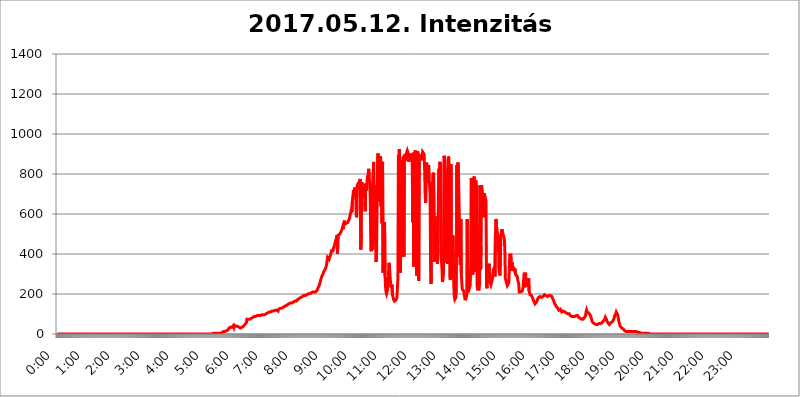
| Category | 2017.05.12. Intenzitás [W/m^2] |
|---|---|
| 0.0 | 0 |
| 0.0006944444444444445 | 0 |
| 0.001388888888888889 | 0 |
| 0.0020833333333333333 | 0 |
| 0.002777777777777778 | 0 |
| 0.003472222222222222 | 0 |
| 0.004166666666666667 | 0 |
| 0.004861111111111111 | 0 |
| 0.005555555555555556 | 0 |
| 0.0062499999999999995 | 0 |
| 0.006944444444444444 | 0 |
| 0.007638888888888889 | 0 |
| 0.008333333333333333 | 0 |
| 0.009027777777777779 | 0 |
| 0.009722222222222222 | 0 |
| 0.010416666666666666 | 0 |
| 0.011111111111111112 | 0 |
| 0.011805555555555555 | 0 |
| 0.012499999999999999 | 0 |
| 0.013194444444444444 | 0 |
| 0.013888888888888888 | 0 |
| 0.014583333333333332 | 0 |
| 0.015277777777777777 | 0 |
| 0.015972222222222224 | 0 |
| 0.016666666666666666 | 0 |
| 0.017361111111111112 | 0 |
| 0.018055555555555557 | 0 |
| 0.01875 | 0 |
| 0.019444444444444445 | 0 |
| 0.02013888888888889 | 0 |
| 0.020833333333333332 | 0 |
| 0.02152777777777778 | 0 |
| 0.022222222222222223 | 0 |
| 0.02291666666666667 | 0 |
| 0.02361111111111111 | 0 |
| 0.024305555555555556 | 0 |
| 0.024999999999999998 | 0 |
| 0.025694444444444447 | 0 |
| 0.02638888888888889 | 0 |
| 0.027083333333333334 | 0 |
| 0.027777777777777776 | 0 |
| 0.02847222222222222 | 0 |
| 0.029166666666666664 | 0 |
| 0.029861111111111113 | 0 |
| 0.030555555555555555 | 0 |
| 0.03125 | 0 |
| 0.03194444444444445 | 0 |
| 0.03263888888888889 | 0 |
| 0.03333333333333333 | 0 |
| 0.034027777777777775 | 0 |
| 0.034722222222222224 | 0 |
| 0.035416666666666666 | 0 |
| 0.036111111111111115 | 0 |
| 0.03680555555555556 | 0 |
| 0.0375 | 0 |
| 0.03819444444444444 | 0 |
| 0.03888888888888889 | 0 |
| 0.03958333333333333 | 0 |
| 0.04027777777777778 | 0 |
| 0.04097222222222222 | 0 |
| 0.041666666666666664 | 0 |
| 0.042361111111111106 | 0 |
| 0.04305555555555556 | 0 |
| 0.043750000000000004 | 0 |
| 0.044444444444444446 | 0 |
| 0.04513888888888889 | 0 |
| 0.04583333333333334 | 0 |
| 0.04652777777777778 | 0 |
| 0.04722222222222222 | 0 |
| 0.04791666666666666 | 0 |
| 0.04861111111111111 | 0 |
| 0.049305555555555554 | 0 |
| 0.049999999999999996 | 0 |
| 0.05069444444444445 | 0 |
| 0.051388888888888894 | 0 |
| 0.052083333333333336 | 0 |
| 0.05277777777777778 | 0 |
| 0.05347222222222222 | 0 |
| 0.05416666666666667 | 0 |
| 0.05486111111111111 | 0 |
| 0.05555555555555555 | 0 |
| 0.05625 | 0 |
| 0.05694444444444444 | 0 |
| 0.057638888888888885 | 0 |
| 0.05833333333333333 | 0 |
| 0.05902777777777778 | 0 |
| 0.059722222222222225 | 0 |
| 0.06041666666666667 | 0 |
| 0.061111111111111116 | 0 |
| 0.06180555555555556 | 0 |
| 0.0625 | 0 |
| 0.06319444444444444 | 0 |
| 0.06388888888888888 | 0 |
| 0.06458333333333334 | 0 |
| 0.06527777777777778 | 0 |
| 0.06597222222222222 | 0 |
| 0.06666666666666667 | 0 |
| 0.06736111111111111 | 0 |
| 0.06805555555555555 | 0 |
| 0.06874999999999999 | 0 |
| 0.06944444444444443 | 0 |
| 0.07013888888888889 | 0 |
| 0.07083333333333333 | 0 |
| 0.07152777777777779 | 0 |
| 0.07222222222222223 | 0 |
| 0.07291666666666667 | 0 |
| 0.07361111111111111 | 0 |
| 0.07430555555555556 | 0 |
| 0.075 | 0 |
| 0.07569444444444444 | 0 |
| 0.0763888888888889 | 0 |
| 0.07708333333333334 | 0 |
| 0.07777777777777778 | 0 |
| 0.07847222222222222 | 0 |
| 0.07916666666666666 | 0 |
| 0.0798611111111111 | 0 |
| 0.08055555555555556 | 0 |
| 0.08125 | 0 |
| 0.08194444444444444 | 0 |
| 0.08263888888888889 | 0 |
| 0.08333333333333333 | 0 |
| 0.08402777777777777 | 0 |
| 0.08472222222222221 | 0 |
| 0.08541666666666665 | 0 |
| 0.08611111111111112 | 0 |
| 0.08680555555555557 | 0 |
| 0.08750000000000001 | 0 |
| 0.08819444444444445 | 0 |
| 0.08888888888888889 | 0 |
| 0.08958333333333333 | 0 |
| 0.09027777777777778 | 0 |
| 0.09097222222222222 | 0 |
| 0.09166666666666667 | 0 |
| 0.09236111111111112 | 0 |
| 0.09305555555555556 | 0 |
| 0.09375 | 0 |
| 0.09444444444444444 | 0 |
| 0.09513888888888888 | 0 |
| 0.09583333333333333 | 0 |
| 0.09652777777777777 | 0 |
| 0.09722222222222222 | 0 |
| 0.09791666666666667 | 0 |
| 0.09861111111111111 | 0 |
| 0.09930555555555555 | 0 |
| 0.09999999999999999 | 0 |
| 0.10069444444444443 | 0 |
| 0.1013888888888889 | 0 |
| 0.10208333333333335 | 0 |
| 0.10277777777777779 | 0 |
| 0.10347222222222223 | 0 |
| 0.10416666666666667 | 0 |
| 0.10486111111111111 | 0 |
| 0.10555555555555556 | 0 |
| 0.10625 | 0 |
| 0.10694444444444444 | 0 |
| 0.1076388888888889 | 0 |
| 0.10833333333333334 | 0 |
| 0.10902777777777778 | 0 |
| 0.10972222222222222 | 0 |
| 0.1111111111111111 | 0 |
| 0.11180555555555556 | 0 |
| 0.11180555555555556 | 0 |
| 0.1125 | 0 |
| 0.11319444444444444 | 0 |
| 0.11388888888888889 | 0 |
| 0.11458333333333333 | 0 |
| 0.11527777777777777 | 0 |
| 0.11597222222222221 | 0 |
| 0.11666666666666665 | 0 |
| 0.1173611111111111 | 0 |
| 0.11805555555555557 | 0 |
| 0.11944444444444445 | 0 |
| 0.12013888888888889 | 0 |
| 0.12083333333333333 | 0 |
| 0.12152777777777778 | 0 |
| 0.12222222222222223 | 0 |
| 0.12291666666666667 | 0 |
| 0.12291666666666667 | 0 |
| 0.12361111111111112 | 0 |
| 0.12430555555555556 | 0 |
| 0.125 | 0 |
| 0.12569444444444444 | 0 |
| 0.12638888888888888 | 0 |
| 0.12708333333333333 | 0 |
| 0.16875 | 0 |
| 0.12847222222222224 | 0 |
| 0.12916666666666668 | 0 |
| 0.12986111111111112 | 0 |
| 0.13055555555555556 | 0 |
| 0.13125 | 0 |
| 0.13194444444444445 | 0 |
| 0.1326388888888889 | 0 |
| 0.13333333333333333 | 0 |
| 0.13402777777777777 | 0 |
| 0.13402777777777777 | 0 |
| 0.13472222222222222 | 0 |
| 0.13541666666666666 | 0 |
| 0.1361111111111111 | 0 |
| 0.13749999999999998 | 0 |
| 0.13819444444444443 | 0 |
| 0.1388888888888889 | 0 |
| 0.13958333333333334 | 0 |
| 0.14027777777777778 | 0 |
| 0.14097222222222222 | 0 |
| 0.14166666666666666 | 0 |
| 0.1423611111111111 | 0 |
| 0.14305555555555557 | 0 |
| 0.14375000000000002 | 0 |
| 0.14444444444444446 | 0 |
| 0.1451388888888889 | 0 |
| 0.1451388888888889 | 0 |
| 0.14652777777777778 | 0 |
| 0.14722222222222223 | 0 |
| 0.14791666666666667 | 0 |
| 0.1486111111111111 | 0 |
| 0.14930555555555555 | 0 |
| 0.15 | 0 |
| 0.15069444444444444 | 0 |
| 0.15138888888888888 | 0 |
| 0.15208333333333332 | 0 |
| 0.15277777777777776 | 0 |
| 0.15347222222222223 | 0 |
| 0.15416666666666667 | 0 |
| 0.15486111111111112 | 0 |
| 0.15555555555555556 | 0 |
| 0.15625 | 0 |
| 0.15694444444444444 | 0 |
| 0.15763888888888888 | 0 |
| 0.15833333333333333 | 0 |
| 0.15902777777777777 | 0 |
| 0.15972222222222224 | 0 |
| 0.16041666666666668 | 0 |
| 0.16111111111111112 | 0 |
| 0.16180555555555556 | 0 |
| 0.1625 | 0 |
| 0.16319444444444445 | 0 |
| 0.1638888888888889 | 0 |
| 0.16458333333333333 | 0 |
| 0.16527777777777777 | 0 |
| 0.16597222222222222 | 0 |
| 0.16666666666666666 | 0 |
| 0.1673611111111111 | 0 |
| 0.16805555555555554 | 0 |
| 0.16874999999999998 | 0 |
| 0.16944444444444443 | 0 |
| 0.17013888888888887 | 0 |
| 0.1708333333333333 | 0 |
| 0.17152777777777775 | 0 |
| 0.17222222222222225 | 0 |
| 0.1729166666666667 | 0 |
| 0.17361111111111113 | 0 |
| 0.17430555555555557 | 0 |
| 0.17500000000000002 | 0 |
| 0.17569444444444446 | 0 |
| 0.1763888888888889 | 0 |
| 0.17708333333333334 | 0 |
| 0.17777777777777778 | 0 |
| 0.17847222222222223 | 0 |
| 0.17916666666666667 | 0 |
| 0.1798611111111111 | 0 |
| 0.18055555555555555 | 0 |
| 0.18125 | 0 |
| 0.18194444444444444 | 0 |
| 0.1826388888888889 | 0 |
| 0.18333333333333335 | 0 |
| 0.1840277777777778 | 0 |
| 0.18472222222222223 | 0 |
| 0.18541666666666667 | 0 |
| 0.18611111111111112 | 0 |
| 0.18680555555555556 | 0 |
| 0.1875 | 0 |
| 0.18819444444444444 | 0 |
| 0.18888888888888888 | 0 |
| 0.18958333333333333 | 0 |
| 0.19027777777777777 | 0 |
| 0.1909722222222222 | 0 |
| 0.19166666666666665 | 0 |
| 0.19236111111111112 | 0 |
| 0.19305555555555554 | 0 |
| 0.19375 | 0 |
| 0.19444444444444445 | 0 |
| 0.1951388888888889 | 0 |
| 0.19583333333333333 | 0 |
| 0.19652777777777777 | 0 |
| 0.19722222222222222 | 0 |
| 0.19791666666666666 | 0 |
| 0.1986111111111111 | 0 |
| 0.19930555555555554 | 0 |
| 0.19999999999999998 | 0 |
| 0.20069444444444443 | 0 |
| 0.20138888888888887 | 0 |
| 0.2020833333333333 | 0 |
| 0.2027777777777778 | 0 |
| 0.2034722222222222 | 0 |
| 0.2041666666666667 | 0 |
| 0.20486111111111113 | 0 |
| 0.20555555555555557 | 0 |
| 0.20625000000000002 | 0 |
| 0.20694444444444446 | 0 |
| 0.2076388888888889 | 0 |
| 0.20833333333333334 | 0 |
| 0.20902777777777778 | 0 |
| 0.20972222222222223 | 0 |
| 0.21041666666666667 | 0 |
| 0.2111111111111111 | 0 |
| 0.21180555555555555 | 0 |
| 0.2125 | 0 |
| 0.21319444444444444 | 0 |
| 0.2138888888888889 | 0 |
| 0.21458333333333335 | 0 |
| 0.2152777777777778 | 0 |
| 0.21597222222222223 | 0 |
| 0.21666666666666667 | 0 |
| 0.21736111111111112 | 0 |
| 0.21805555555555556 | 0 |
| 0.21875 | 3.525 |
| 0.21944444444444444 | 3.525 |
| 0.22013888888888888 | 3.525 |
| 0.22083333333333333 | 3.525 |
| 0.22152777777777777 | 3.525 |
| 0.2222222222222222 | 3.525 |
| 0.22291666666666665 | 3.525 |
| 0.2236111111111111 | 3.525 |
| 0.22430555555555556 | 3.525 |
| 0.225 | 3.525 |
| 0.22569444444444445 | 3.525 |
| 0.2263888888888889 | 3.525 |
| 0.22708333333333333 | 3.525 |
| 0.22777777777777777 | 3.525 |
| 0.22847222222222222 | 3.525 |
| 0.22916666666666666 | 3.525 |
| 0.2298611111111111 | 7.887 |
| 0.23055555555555554 | 7.887 |
| 0.23124999999999998 | 7.887 |
| 0.23194444444444443 | 7.887 |
| 0.23263888888888887 | 7.887 |
| 0.2333333333333333 | 12.257 |
| 0.2340277777777778 | 12.257 |
| 0.2347222222222222 | 12.257 |
| 0.2354166666666667 | 12.257 |
| 0.23611111111111113 | 12.257 |
| 0.23680555555555557 | 16.636 |
| 0.23750000000000002 | 16.636 |
| 0.23819444444444446 | 21.024 |
| 0.2388888888888889 | 21.024 |
| 0.23958333333333334 | 21.024 |
| 0.24027777777777778 | 25.419 |
| 0.24097222222222223 | 29.823 |
| 0.24166666666666667 | 29.823 |
| 0.2423611111111111 | 34.234 |
| 0.24305555555555555 | 34.234 |
| 0.24375 | 34.234 |
| 0.24444444444444446 | 34.234 |
| 0.24513888888888888 | 34.234 |
| 0.24583333333333335 | 34.234 |
| 0.2465277777777778 | 34.234 |
| 0.24722222222222223 | 43.079 |
| 0.24791666666666667 | 34.234 |
| 0.24861111111111112 | 43.079 |
| 0.24930555555555556 | 43.079 |
| 0.25 | 43.079 |
| 0.25069444444444444 | 38.653 |
| 0.2513888888888889 | 38.653 |
| 0.2520833333333333 | 38.653 |
| 0.25277777777777777 | 38.653 |
| 0.2534722222222222 | 38.653 |
| 0.25416666666666665 | 38.653 |
| 0.2548611111111111 | 34.234 |
| 0.2555555555555556 | 29.823 |
| 0.25625000000000003 | 29.823 |
| 0.2569444444444445 | 29.823 |
| 0.2576388888888889 | 29.823 |
| 0.25833333333333336 | 29.823 |
| 0.2590277777777778 | 34.234 |
| 0.25972222222222224 | 34.234 |
| 0.2604166666666667 | 34.234 |
| 0.2611111111111111 | 38.653 |
| 0.26180555555555557 | 43.079 |
| 0.2625 | 43.079 |
| 0.26319444444444445 | 47.511 |
| 0.2638888888888889 | 47.511 |
| 0.26458333333333334 | 47.511 |
| 0.2652777777777778 | 56.398 |
| 0.2659722222222222 | 74.246 |
| 0.26666666666666666 | 74.246 |
| 0.2673611111111111 | 69.775 |
| 0.26805555555555555 | 74.246 |
| 0.26875 | 74.246 |
| 0.26944444444444443 | 74.246 |
| 0.2701388888888889 | 74.246 |
| 0.2708333333333333 | 78.722 |
| 0.27152777777777776 | 78.722 |
| 0.2722222222222222 | 78.722 |
| 0.27291666666666664 | 83.205 |
| 0.2736111111111111 | 83.205 |
| 0.2743055555555555 | 83.205 |
| 0.27499999999999997 | 83.205 |
| 0.27569444444444446 | 83.205 |
| 0.27638888888888885 | 87.692 |
| 0.27708333333333335 | 87.692 |
| 0.2777777777777778 | 87.692 |
| 0.27847222222222223 | 87.692 |
| 0.2791666666666667 | 87.692 |
| 0.2798611111111111 | 87.692 |
| 0.28055555555555556 | 92.184 |
| 0.28125 | 92.184 |
| 0.28194444444444444 | 92.184 |
| 0.2826388888888889 | 92.184 |
| 0.2833333333333333 | 92.184 |
| 0.28402777777777777 | 92.184 |
| 0.2847222222222222 | 92.184 |
| 0.28541666666666665 | 96.682 |
| 0.28611111111111115 | 96.682 |
| 0.28680555555555554 | 96.682 |
| 0.28750000000000003 | 96.682 |
| 0.2881944444444445 | 96.682 |
| 0.2888888888888889 | 96.682 |
| 0.28958333333333336 | 96.682 |
| 0.2902777777777778 | 96.682 |
| 0.29097222222222224 | 96.682 |
| 0.2916666666666667 | 101.184 |
| 0.2923611111111111 | 101.184 |
| 0.29305555555555557 | 101.184 |
| 0.29375 | 101.184 |
| 0.29444444444444445 | 105.69 |
| 0.2951388888888889 | 105.69 |
| 0.29583333333333334 | 105.69 |
| 0.2965277777777778 | 105.69 |
| 0.2972222222222222 | 110.201 |
| 0.29791666666666666 | 110.201 |
| 0.2986111111111111 | 110.201 |
| 0.29930555555555555 | 110.201 |
| 0.3 | 110.201 |
| 0.30069444444444443 | 114.716 |
| 0.3013888888888889 | 114.716 |
| 0.3020833333333333 | 114.716 |
| 0.30277777777777776 | 114.716 |
| 0.3034722222222222 | 114.716 |
| 0.30416666666666664 | 114.716 |
| 0.3048611111111111 | 119.235 |
| 0.3055555555555555 | 119.235 |
| 0.30624999999999997 | 119.235 |
| 0.3069444444444444 | 119.235 |
| 0.3076388888888889 | 119.235 |
| 0.30833333333333335 | 119.235 |
| 0.3090277777777778 | 119.235 |
| 0.30972222222222223 | 114.716 |
| 0.3104166666666667 | 123.758 |
| 0.3111111111111111 | 123.758 |
| 0.31180555555555556 | 123.758 |
| 0.3125 | 128.284 |
| 0.31319444444444444 | 128.284 |
| 0.3138888888888889 | 128.284 |
| 0.3145833333333333 | 128.284 |
| 0.31527777777777777 | 132.814 |
| 0.3159722222222222 | 132.814 |
| 0.31666666666666665 | 132.814 |
| 0.31736111111111115 | 137.347 |
| 0.31805555555555554 | 137.347 |
| 0.31875000000000003 | 137.347 |
| 0.3194444444444445 | 137.347 |
| 0.3201388888888889 | 141.884 |
| 0.32083333333333336 | 141.884 |
| 0.3215277777777778 | 146.423 |
| 0.32222222222222224 | 146.423 |
| 0.3229166666666667 | 146.423 |
| 0.3236111111111111 | 146.423 |
| 0.32430555555555557 | 150.964 |
| 0.325 | 150.964 |
| 0.32569444444444445 | 150.964 |
| 0.3263888888888889 | 150.964 |
| 0.32708333333333334 | 155.509 |
| 0.3277777777777778 | 155.509 |
| 0.3284722222222222 | 155.509 |
| 0.32916666666666666 | 155.509 |
| 0.3298611111111111 | 155.509 |
| 0.33055555555555555 | 160.056 |
| 0.33125 | 160.056 |
| 0.33194444444444443 | 160.056 |
| 0.3326388888888889 | 164.605 |
| 0.3333333333333333 | 164.605 |
| 0.3340277777777778 | 164.605 |
| 0.3347222222222222 | 164.605 |
| 0.3354166666666667 | 164.605 |
| 0.3361111111111111 | 169.156 |
| 0.3368055555555556 | 169.156 |
| 0.33749999999999997 | 173.709 |
| 0.33819444444444446 | 173.709 |
| 0.33888888888888885 | 173.709 |
| 0.33958333333333335 | 178.264 |
| 0.34027777777777773 | 178.264 |
| 0.34097222222222223 | 178.264 |
| 0.3416666666666666 | 182.82 |
| 0.3423611111111111 | 182.82 |
| 0.3430555555555555 | 182.82 |
| 0.34375 | 187.378 |
| 0.3444444444444445 | 187.378 |
| 0.3451388888888889 | 191.937 |
| 0.3458333333333334 | 191.937 |
| 0.34652777777777777 | 191.937 |
| 0.34722222222222227 | 191.937 |
| 0.34791666666666665 | 191.937 |
| 0.34861111111111115 | 191.937 |
| 0.34930555555555554 | 196.497 |
| 0.35000000000000003 | 196.497 |
| 0.3506944444444444 | 196.497 |
| 0.3513888888888889 | 201.058 |
| 0.3520833333333333 | 201.058 |
| 0.3527777777777778 | 201.058 |
| 0.3534722222222222 | 201.058 |
| 0.3541666666666667 | 201.058 |
| 0.3548611111111111 | 205.62 |
| 0.35555555555555557 | 205.62 |
| 0.35625 | 205.62 |
| 0.35694444444444445 | 205.62 |
| 0.3576388888888889 | 210.182 |
| 0.35833333333333334 | 210.182 |
| 0.3590277777777778 | 210.182 |
| 0.3597222222222222 | 210.182 |
| 0.36041666666666666 | 210.182 |
| 0.3611111111111111 | 210.182 |
| 0.36180555555555555 | 210.182 |
| 0.3625 | 210.182 |
| 0.36319444444444443 | 210.182 |
| 0.3638888888888889 | 214.746 |
| 0.3645833333333333 | 219.309 |
| 0.3652777777777778 | 223.873 |
| 0.3659722222222222 | 233 |
| 0.3666666666666667 | 237.564 |
| 0.3673611111111111 | 242.127 |
| 0.3680555555555556 | 251.251 |
| 0.36874999999999997 | 260.373 |
| 0.36944444444444446 | 269.49 |
| 0.37013888888888885 | 278.603 |
| 0.37083333333333335 | 283.156 |
| 0.37152777777777773 | 292.259 |
| 0.37222222222222223 | 296.808 |
| 0.3729166666666666 | 301.354 |
| 0.3736111111111111 | 310.44 |
| 0.3743055555555555 | 314.98 |
| 0.375 | 319.517 |
| 0.3756944444444445 | 324.052 |
| 0.3763888888888889 | 328.584 |
| 0.3770833333333334 | 337.639 |
| 0.37777777777777777 | 346.682 |
| 0.37847222222222227 | 364.728 |
| 0.37916666666666665 | 382.715 |
| 0.37986111111111115 | 387.202 |
| 0.38055555555555554 | 387.202 |
| 0.38125000000000003 | 373.729 |
| 0.3819444444444444 | 382.715 |
| 0.3826388888888889 | 387.202 |
| 0.3833333333333333 | 396.164 |
| 0.3840277777777778 | 400.638 |
| 0.3847222222222222 | 414.035 |
| 0.3854166666666667 | 422.943 |
| 0.3861111111111111 | 409.574 |
| 0.38680555555555557 | 422.943 |
| 0.3875 | 422.943 |
| 0.38819444444444445 | 436.27 |
| 0.3888888888888889 | 445.129 |
| 0.38958333333333334 | 453.968 |
| 0.3902777777777778 | 462.786 |
| 0.3909722222222222 | 453.968 |
| 0.39166666666666666 | 475.972 |
| 0.3923611111111111 | 493.475 |
| 0.39305555555555555 | 400.638 |
| 0.39375 | 493.475 |
| 0.39444444444444443 | 493.475 |
| 0.3951388888888889 | 489.108 |
| 0.3958333333333333 | 497.836 |
| 0.3965277777777778 | 497.836 |
| 0.3972222222222222 | 502.192 |
| 0.3979166666666667 | 510.885 |
| 0.3986111111111111 | 515.223 |
| 0.3993055555555556 | 523.88 |
| 0.39999999999999997 | 532.513 |
| 0.40069444444444446 | 523.88 |
| 0.40138888888888885 | 536.82 |
| 0.40208333333333335 | 558.261 |
| 0.40277777777777773 | 566.793 |
| 0.40347222222222223 | 549.704 |
| 0.4041666666666666 | 545.416 |
| 0.4048611111111111 | 549.704 |
| 0.4055555555555555 | 553.986 |
| 0.40625 | 553.986 |
| 0.4069444444444445 | 553.986 |
| 0.4076388888888889 | 558.261 |
| 0.4083333333333334 | 566.793 |
| 0.40902777777777777 | 566.793 |
| 0.40972222222222227 | 575.299 |
| 0.41041666666666665 | 588.009 |
| 0.41111111111111115 | 600.661 |
| 0.41180555555555554 | 609.062 |
| 0.41250000000000003 | 625.784 |
| 0.4131944444444444 | 609.062 |
| 0.4138888888888889 | 663.019 |
| 0.4145833333333333 | 687.544 |
| 0.4152777777777778 | 711.832 |
| 0.4159722222222222 | 719.877 |
| 0.4166666666666667 | 707.8 |
| 0.4173611111111111 | 731.896 |
| 0.41805555555555557 | 731.896 |
| 0.41875 | 683.473 |
| 0.41944444444444445 | 583.779 |
| 0.4201388888888889 | 592.233 |
| 0.42083333333333334 | 743.859 |
| 0.4215277777777778 | 743.859 |
| 0.4222222222222222 | 743.859 |
| 0.42291666666666666 | 759.723 |
| 0.4236111111111111 | 727.896 |
| 0.42430555555555555 | 767.62 |
| 0.425 | 775.492 |
| 0.42569444444444443 | 422.943 |
| 0.4263888888888889 | 497.836 |
| 0.4270833333333333 | 759.723 |
| 0.4277777777777778 | 743.859 |
| 0.4284722222222222 | 683.473 |
| 0.4291666666666667 | 687.544 |
| 0.4298611111111111 | 699.717 |
| 0.4305555555555556 | 703.762 |
| 0.43124999999999997 | 735.89 |
| 0.43194444444444446 | 613.252 |
| 0.43263888888888885 | 751.803 |
| 0.43333333333333335 | 715.858 |
| 0.43402777777777773 | 731.896 |
| 0.43472222222222223 | 775.492 |
| 0.4354166666666666 | 791.169 |
| 0.4361111111111111 | 798.974 |
| 0.4368055555555555 | 826.123 |
| 0.4375 | 791.169 |
| 0.4381944444444445 | 751.803 |
| 0.4388888888888889 | 695.666 |
| 0.4395833333333334 | 506.542 |
| 0.44027777777777777 | 414.035 |
| 0.44097222222222227 | 575.299 |
| 0.44166666666666665 | 755.766 |
| 0.44236111111111115 | 422.943 |
| 0.44305555555555554 | 806.757 |
| 0.44375000000000003 | 860.676 |
| 0.4444444444444444 | 519.555 |
| 0.4451388888888889 | 743.859 |
| 0.4458333333333333 | 549.704 |
| 0.4465277777777778 | 458.38 |
| 0.4472222222222222 | 360.221 |
| 0.4479166666666667 | 422.943 |
| 0.4486111111111111 | 638.256 |
| 0.44930555555555557 | 879.719 |
| 0.45 | 902.447 |
| 0.45069444444444445 | 787.258 |
| 0.4513888888888889 | 663.019 |
| 0.45208333333333334 | 887.309 |
| 0.4527777777777778 | 798.974 |
| 0.4534722222222222 | 887.309 |
| 0.45416666666666666 | 638.256 |
| 0.4548611111111111 | 798.974 |
| 0.45555555555555555 | 553.986 |
| 0.45625 | 860.676 |
| 0.45694444444444443 | 305.898 |
| 0.4576388888888889 | 324.052 |
| 0.4583333333333333 | 391.685 |
| 0.4590277777777778 | 558.261 |
| 0.4597222222222222 | 292.259 |
| 0.4604166666666667 | 237.564 |
| 0.4611111111111111 | 210.182 |
| 0.4618055555555556 | 201.058 |
| 0.46249999999999997 | 205.62 |
| 0.46319444444444446 | 219.309 |
| 0.46388888888888885 | 255.813 |
| 0.46458333333333335 | 296.808 |
| 0.46527777777777773 | 355.712 |
| 0.46597222222222223 | 333.113 |
| 0.4666666666666666 | 333.113 |
| 0.4673611111111111 | 260.373 |
| 0.4680555555555555 | 233 |
| 0.46875 | 233 |
| 0.4694444444444445 | 246.689 |
| 0.4701388888888889 | 196.497 |
| 0.4708333333333334 | 187.378 |
| 0.47152777777777777 | 173.709 |
| 0.47222222222222227 | 169.156 |
| 0.47291666666666665 | 164.605 |
| 0.47361111111111115 | 164.605 |
| 0.47430555555555554 | 169.156 |
| 0.47500000000000003 | 169.156 |
| 0.4756944444444444 | 173.709 |
| 0.4763888888888889 | 182.82 |
| 0.4770833333333333 | 228.436 |
| 0.4777777777777778 | 278.603 |
| 0.4784722222222222 | 894.885 |
| 0.4791666666666667 | 849.199 |
| 0.4798611111111111 | 925.06 |
| 0.48055555555555557 | 925.06 |
| 0.48125 | 305.898 |
| 0.48194444444444445 | 449.551 |
| 0.4826388888888889 | 650.667 |
| 0.48333333333333334 | 787.258 |
| 0.4840277777777778 | 868.305 |
| 0.4847222222222222 | 822.26 |
| 0.48541666666666666 | 887.309 |
| 0.4861111111111111 | 387.202 |
| 0.48680555555555555 | 845.365 |
| 0.4875 | 898.668 |
| 0.48819444444444443 | 868.305 |
| 0.4888888888888889 | 894.885 |
| 0.4895833333333333 | 894.885 |
| 0.4902777777777778 | 894.885 |
| 0.4909722222222222 | 917.534 |
| 0.4916666666666667 | 909.996 |
| 0.4923611111111111 | 898.668 |
| 0.4930555555555556 | 860.676 |
| 0.49374999999999997 | 902.447 |
| 0.49444444444444446 | 868.305 |
| 0.49513888888888885 | 894.885 |
| 0.49583333333333335 | 898.668 |
| 0.49652777777777773 | 872.114 |
| 0.49722222222222223 | 891.099 |
| 0.4979166666666666 | 898.668 |
| 0.4986111111111111 | 558.261 |
| 0.4993055555555555 | 906.223 |
| 0.5 | 337.639 |
| 0.5006944444444444 | 902.447 |
| 0.5013888888888889 | 856.855 |
| 0.5020833333333333 | 917.534 |
| 0.5027777777777778 | 853.029 |
| 0.5034722222222222 | 735.89 |
| 0.5041666666666667 | 292.259 |
| 0.5048611111111111 | 617.436 |
| 0.5055555555555555 | 913.766 |
| 0.50625 | 743.859 |
| 0.5069444444444444 | 264.932 |
| 0.5076388888888889 | 879.719 |
| 0.5083333333333333 | 898.668 |
| 0.5090277777777777 | 868.305 |
| 0.5097222222222222 | 887.309 |
| 0.5104166666666666 | 883.516 |
| 0.5111111111111112 | 883.516 |
| 0.5118055555555555 | 879.719 |
| 0.5125000000000001 | 909.996 |
| 0.5131944444444444 | 909.996 |
| 0.513888888888889 | 906.223 |
| 0.5145833333333333 | 898.668 |
| 0.5152777777777778 | 818.392 |
| 0.5159722222222222 | 703.762 |
| 0.5166666666666667 | 654.791 |
| 0.517361111111111 | 810.641 |
| 0.5180555555555556 | 856.855 |
| 0.5187499999999999 | 787.258 |
| 0.5194444444444445 | 755.766 |
| 0.5201388888888888 | 798.974 |
| 0.5208333333333334 | 845.365 |
| 0.5215277777777778 | 775.492 |
| 0.5222222222222223 | 743.859 |
| 0.5229166666666667 | 695.666 |
| 0.5236111111111111 | 369.23 |
| 0.5243055555555556 | 251.251 |
| 0.525 | 759.723 |
| 0.5256944444444445 | 719.877 |
| 0.5263888888888889 | 583.779 |
| 0.5270833333333333 | 798.974 |
| 0.5277777777777778 | 806.757 |
| 0.5284722222222222 | 575.299 |
| 0.5291666666666667 | 360.221 |
| 0.5298611111111111 | 588.009 |
| 0.5305555555555556 | 471.582 |
| 0.53125 | 400.638 |
| 0.5319444444444444 | 467.187 |
| 0.5326388888888889 | 409.574 |
| 0.5333333333333333 | 351.198 |
| 0.5340277777777778 | 427.39 |
| 0.5347222222222222 | 759.723 |
| 0.5354166666666667 | 826.123 |
| 0.5361111111111111 | 735.89 |
| 0.5368055555555555 | 860.676 |
| 0.5375 | 822.26 |
| 0.5381944444444444 | 449.551 |
| 0.5388888888888889 | 364.728 |
| 0.5395833333333333 | 328.584 |
| 0.5402777777777777 | 260.373 |
| 0.5409722222222222 | 278.603 |
| 0.5416666666666666 | 296.808 |
| 0.5423611111111112 | 891.099 |
| 0.5430555555555555 | 883.516 |
| 0.5437500000000001 | 872.114 |
| 0.5444444444444444 | 868.305 |
| 0.545138888888889 | 759.723 |
| 0.5458333333333333 | 355.712 |
| 0.5465277777777778 | 409.574 |
| 0.5472222222222222 | 351.198 |
| 0.5479166666666667 | 458.38 |
| 0.548611111111111 | 887.309 |
| 0.5493055555555556 | 875.918 |
| 0.5499999999999999 | 755.766 |
| 0.5506944444444445 | 287.709 |
| 0.5513888888888888 | 269.49 |
| 0.5520833333333334 | 849.199 |
| 0.5527777777777778 | 324.052 |
| 0.5534722222222223 | 278.603 |
| 0.5541666666666667 | 310.44 |
| 0.5548611111111111 | 493.475 |
| 0.5555555555555556 | 360.221 |
| 0.55625 | 233 |
| 0.5569444444444445 | 187.378 |
| 0.5576388888888889 | 173.709 |
| 0.5583333333333333 | 169.156 |
| 0.5590277777777778 | 182.82 |
| 0.5597222222222222 | 210.182 |
| 0.5604166666666667 | 845.365 |
| 0.5611111111111111 | 387.202 |
| 0.5618055555555556 | 856.855 |
| 0.5625 | 845.365 |
| 0.5631944444444444 | 849.199 |
| 0.5638888888888889 | 841.526 |
| 0.5645833333333333 | 462.786 |
| 0.5652777777777778 | 346.682 |
| 0.5659722222222222 | 575.299 |
| 0.5666666666666667 | 305.898 |
| 0.5673611111111111 | 260.373 |
| 0.5680555555555555 | 223.873 |
| 0.56875 | 219.309 |
| 0.5694444444444444 | 219.309 |
| 0.5701388888888889 | 214.746 |
| 0.5708333333333333 | 196.497 |
| 0.5715277777777777 | 182.82 |
| 0.5722222222222222 | 169.156 |
| 0.5729166666666666 | 169.156 |
| 0.5736111111111112 | 173.709 |
| 0.5743055555555555 | 196.497 |
| 0.5750000000000001 | 575.299 |
| 0.5756944444444444 | 228.436 |
| 0.576388888888889 | 233 |
| 0.5770833333333333 | 219.309 |
| 0.5777777777777778 | 214.746 |
| 0.5784722222222222 | 219.309 |
| 0.5791666666666667 | 242.127 |
| 0.579861111111111 | 328.584 |
| 0.5805555555555556 | 779.42 |
| 0.5812499999999999 | 779.42 |
| 0.5819444444444445 | 751.803 |
| 0.5826388888888888 | 296.808 |
| 0.5833333333333334 | 314.98 |
| 0.5840277777777778 | 369.23 |
| 0.5847222222222223 | 787.258 |
| 0.5854166666666667 | 427.39 |
| 0.5861111111111111 | 310.44 |
| 0.5868055555555556 | 767.62 |
| 0.5875 | 751.803 |
| 0.5881944444444445 | 731.896 |
| 0.5888888888888889 | 242.127 |
| 0.5895833333333333 | 223.873 |
| 0.5902777777777778 | 223.873 |
| 0.5909722222222222 | 219.309 |
| 0.5916666666666667 | 223.873 |
| 0.5923611111111111 | 255.813 |
| 0.5930555555555556 | 743.859 |
| 0.59375 | 319.517 |
| 0.5944444444444444 | 440.702 |
| 0.5951388888888889 | 743.859 |
| 0.5958333333333333 | 711.832 |
| 0.5965277777777778 | 715.858 |
| 0.5972222222222222 | 695.666 |
| 0.5979166666666667 | 583.779 |
| 0.5986111111111111 | 703.762 |
| 0.5993055555555555 | 703.762 |
| 0.6 | 683.473 |
| 0.6006944444444444 | 675.311 |
| 0.6013888888888889 | 663.019 |
| 0.6020833333333333 | 237.564 |
| 0.6027777777777777 | 228.436 |
| 0.6034722222222222 | 346.682 |
| 0.6041666666666666 | 264.932 |
| 0.6048611111111112 | 269.49 |
| 0.6055555555555555 | 351.198 |
| 0.6062500000000001 | 296.808 |
| 0.6069444444444444 | 274.047 |
| 0.607638888888889 | 255.813 |
| 0.6083333333333333 | 246.689 |
| 0.6090277777777778 | 251.251 |
| 0.6097222222222222 | 264.932 |
| 0.6104166666666667 | 278.603 |
| 0.611111111111111 | 305.898 |
| 0.6118055555555556 | 324.052 |
| 0.6124999999999999 | 324.052 |
| 0.6131944444444445 | 333.113 |
| 0.6138888888888888 | 287.709 |
| 0.6145833333333334 | 497.836 |
| 0.6152777777777778 | 575.299 |
| 0.6159722222222223 | 571.049 |
| 0.6166666666666667 | 515.223 |
| 0.6173611111111111 | 519.555 |
| 0.6180555555555556 | 515.223 |
| 0.61875 | 484.735 |
| 0.6194444444444445 | 314.98 |
| 0.6201388888888889 | 305.898 |
| 0.6208333333333333 | 292.259 |
| 0.6215277777777778 | 387.202 |
| 0.6222222222222222 | 497.836 |
| 0.6229166666666667 | 506.542 |
| 0.6236111111111111 | 523.88 |
| 0.6243055555555556 | 515.223 |
| 0.625 | 502.192 |
| 0.6256944444444444 | 493.475 |
| 0.6263888888888889 | 497.836 |
| 0.6270833333333333 | 471.582 |
| 0.6277777777777778 | 418.492 |
| 0.6284722222222222 | 278.603 |
| 0.6291666666666667 | 269.49 |
| 0.6298611111111111 | 260.373 |
| 0.6305555555555555 | 251.251 |
| 0.63125 | 242.127 |
| 0.6319444444444444 | 237.564 |
| 0.6326388888888889 | 237.564 |
| 0.6333333333333333 | 255.813 |
| 0.6340277777777777 | 251.251 |
| 0.6347222222222222 | 400.638 |
| 0.6354166666666666 | 391.685 |
| 0.6361111111111112 | 400.638 |
| 0.6368055555555555 | 314.98 |
| 0.6375000000000001 | 360.221 |
| 0.6381944444444444 | 346.682 |
| 0.638888888888889 | 342.162 |
| 0.6395833333333333 | 333.113 |
| 0.6402777777777778 | 333.113 |
| 0.6409722222222222 | 319.517 |
| 0.6416666666666667 | 328.584 |
| 0.642361111111111 | 324.052 |
| 0.6430555555555556 | 296.808 |
| 0.6437499999999999 | 296.808 |
| 0.6444444444444445 | 296.808 |
| 0.6451388888888888 | 287.709 |
| 0.6458333333333334 | 269.49 |
| 0.6465277777777778 | 260.373 |
| 0.6472222222222223 | 251.251 |
| 0.6479166666666667 | 210.182 |
| 0.6486111111111111 | 205.62 |
| 0.6493055555555556 | 210.182 |
| 0.65 | 210.182 |
| 0.6506944444444445 | 205.62 |
| 0.6513888888888889 | 214.746 |
| 0.6520833333333333 | 214.746 |
| 0.6527777777777778 | 223.873 |
| 0.6534722222222222 | 237.564 |
| 0.6541666666666667 | 274.047 |
| 0.6548611111111111 | 301.354 |
| 0.6555555555555556 | 296.808 |
| 0.65625 | 301.354 |
| 0.6569444444444444 | 301.354 |
| 0.6576388888888889 | 242.127 |
| 0.6583333333333333 | 242.127 |
| 0.6590277777777778 | 246.689 |
| 0.6597222222222222 | 246.689 |
| 0.6604166666666667 | 255.813 |
| 0.6611111111111111 | 278.603 |
| 0.6618055555555555 | 214.746 |
| 0.6625 | 214.746 |
| 0.6631944444444444 | 196.497 |
| 0.6638888888888889 | 191.937 |
| 0.6645833333333333 | 191.937 |
| 0.6652777777777777 | 191.937 |
| 0.6659722222222222 | 191.937 |
| 0.6666666666666666 | 191.937 |
| 0.6673611111111111 | 173.709 |
| 0.6680555555555556 | 169.156 |
| 0.6687500000000001 | 160.056 |
| 0.6694444444444444 | 155.509 |
| 0.6701388888888888 | 150.964 |
| 0.6708333333333334 | 155.509 |
| 0.6715277777777778 | 155.509 |
| 0.6722222222222222 | 160.056 |
| 0.6729166666666666 | 164.605 |
| 0.6736111111111112 | 173.709 |
| 0.6743055555555556 | 178.264 |
| 0.6749999999999999 | 182.82 |
| 0.6756944444444444 | 182.82 |
| 0.6763888888888889 | 178.264 |
| 0.6770833333333334 | 187.378 |
| 0.6777777777777777 | 187.378 |
| 0.6784722222222223 | 187.378 |
| 0.6791666666666667 | 182.82 |
| 0.6798611111111111 | 182.82 |
| 0.6805555555555555 | 182.82 |
| 0.68125 | 187.378 |
| 0.6819444444444445 | 191.937 |
| 0.6826388888888889 | 187.378 |
| 0.6833333333333332 | 196.497 |
| 0.6840277777777778 | 196.497 |
| 0.6847222222222222 | 196.497 |
| 0.6854166666666667 | 191.937 |
| 0.686111111111111 | 191.937 |
| 0.6868055555555556 | 191.937 |
| 0.6875 | 187.378 |
| 0.6881944444444444 | 182.82 |
| 0.688888888888889 | 187.378 |
| 0.6895833333333333 | 191.937 |
| 0.6902777777777778 | 191.937 |
| 0.6909722222222222 | 191.937 |
| 0.6916666666666668 | 191.937 |
| 0.6923611111111111 | 191.937 |
| 0.6930555555555555 | 187.378 |
| 0.69375 | 187.378 |
| 0.6944444444444445 | 182.82 |
| 0.6951388888888889 | 173.709 |
| 0.6958333333333333 | 169.156 |
| 0.6965277777777777 | 164.605 |
| 0.6972222222222223 | 155.509 |
| 0.6979166666666666 | 150.964 |
| 0.6986111111111111 | 146.423 |
| 0.6993055555555556 | 141.884 |
| 0.7000000000000001 | 137.347 |
| 0.7006944444444444 | 132.814 |
| 0.7013888888888888 | 132.814 |
| 0.7020833333333334 | 128.284 |
| 0.7027777777777778 | 123.758 |
| 0.7034722222222222 | 119.235 |
| 0.7041666666666666 | 119.235 |
| 0.7048611111111112 | 119.235 |
| 0.7055555555555556 | 123.758 |
| 0.7062499999999999 | 119.235 |
| 0.7069444444444444 | 119.235 |
| 0.7076388888888889 | 110.201 |
| 0.7083333333333334 | 110.201 |
| 0.7090277777777777 | 114.716 |
| 0.7097222222222223 | 114.716 |
| 0.7104166666666667 | 114.716 |
| 0.7111111111111111 | 110.201 |
| 0.7118055555555555 | 110.201 |
| 0.7125 | 105.69 |
| 0.7131944444444445 | 110.201 |
| 0.7138888888888889 | 105.69 |
| 0.7145833333333332 | 105.69 |
| 0.7152777777777778 | 105.69 |
| 0.7159722222222222 | 101.184 |
| 0.7166666666666667 | 101.184 |
| 0.717361111111111 | 101.184 |
| 0.7180555555555556 | 101.184 |
| 0.71875 | 96.682 |
| 0.7194444444444444 | 92.184 |
| 0.720138888888889 | 92.184 |
| 0.7208333333333333 | 92.184 |
| 0.7215277777777778 | 87.692 |
| 0.7222222222222222 | 87.692 |
| 0.7229166666666668 | 87.692 |
| 0.7236111111111111 | 87.692 |
| 0.7243055555555555 | 87.692 |
| 0.725 | 87.692 |
| 0.7256944444444445 | 87.692 |
| 0.7263888888888889 | 92.184 |
| 0.7270833333333333 | 92.184 |
| 0.7277777777777777 | 92.184 |
| 0.7284722222222223 | 92.184 |
| 0.7291666666666666 | 92.184 |
| 0.7298611111111111 | 92.184 |
| 0.7305555555555556 | 87.692 |
| 0.7312500000000001 | 83.205 |
| 0.7319444444444444 | 83.205 |
| 0.7326388888888888 | 78.722 |
| 0.7333333333333334 | 78.722 |
| 0.7340277777777778 | 74.246 |
| 0.7347222222222222 | 74.246 |
| 0.7354166666666666 | 74.246 |
| 0.7361111111111112 | 74.246 |
| 0.7368055555555556 | 74.246 |
| 0.7374999999999999 | 74.246 |
| 0.7381944444444444 | 74.246 |
| 0.7388888888888889 | 78.722 |
| 0.7395833333333334 | 83.205 |
| 0.7402777777777777 | 87.692 |
| 0.7409722222222223 | 92.184 |
| 0.7416666666666667 | 110.201 |
| 0.7423611111111111 | 119.235 |
| 0.7430555555555555 | 110.201 |
| 0.74375 | 110.201 |
| 0.7444444444444445 | 110.201 |
| 0.7451388888888889 | 105.69 |
| 0.7458333333333332 | 101.184 |
| 0.7465277777777778 | 101.184 |
| 0.7472222222222222 | 96.682 |
| 0.7479166666666667 | 92.184 |
| 0.748611111111111 | 83.205 |
| 0.7493055555555556 | 74.246 |
| 0.75 | 65.31 |
| 0.7506944444444444 | 60.85 |
| 0.751388888888889 | 56.398 |
| 0.7520833333333333 | 56.398 |
| 0.7527777777777778 | 56.398 |
| 0.7534722222222222 | 51.951 |
| 0.7541666666666668 | 47.511 |
| 0.7548611111111111 | 47.511 |
| 0.7555555555555555 | 47.511 |
| 0.75625 | 47.511 |
| 0.7569444444444445 | 47.511 |
| 0.7576388888888889 | 47.511 |
| 0.7583333333333333 | 47.511 |
| 0.7590277777777777 | 47.511 |
| 0.7597222222222223 | 51.951 |
| 0.7604166666666666 | 51.951 |
| 0.7611111111111111 | 51.951 |
| 0.7618055555555556 | 51.951 |
| 0.7625000000000001 | 51.951 |
| 0.7631944444444444 | 51.951 |
| 0.7638888888888888 | 56.398 |
| 0.7645833333333334 | 56.398 |
| 0.7652777777777778 | 60.85 |
| 0.7659722222222222 | 65.31 |
| 0.7666666666666666 | 69.775 |
| 0.7673611111111112 | 69.775 |
| 0.7680555555555556 | 74.246 |
| 0.7687499999999999 | 83.205 |
| 0.7694444444444444 | 83.205 |
| 0.7701388888888889 | 74.246 |
| 0.7708333333333334 | 65.31 |
| 0.7715277777777777 | 60.85 |
| 0.7722222222222223 | 56.398 |
| 0.7729166666666667 | 51.951 |
| 0.7736111111111111 | 51.951 |
| 0.7743055555555555 | 47.511 |
| 0.775 | 51.951 |
| 0.7756944444444445 | 51.951 |
| 0.7763888888888889 | 56.398 |
| 0.7770833333333332 | 56.398 |
| 0.7777777777777778 | 56.398 |
| 0.7784722222222222 | 60.85 |
| 0.7791666666666667 | 60.85 |
| 0.779861111111111 | 65.31 |
| 0.7805555555555556 | 74.246 |
| 0.78125 | 83.205 |
| 0.7819444444444444 | 92.184 |
| 0.782638888888889 | 96.682 |
| 0.7833333333333333 | 101.184 |
| 0.7840277777777778 | 110.201 |
| 0.7847222222222222 | 110.201 |
| 0.7854166666666668 | 105.69 |
| 0.7861111111111111 | 96.682 |
| 0.7868055555555555 | 78.722 |
| 0.7875 | 65.31 |
| 0.7881944444444445 | 56.398 |
| 0.7888888888888889 | 47.511 |
| 0.7895833333333333 | 38.653 |
| 0.7902777777777777 | 34.234 |
| 0.7909722222222223 | 34.234 |
| 0.7916666666666666 | 29.823 |
| 0.7923611111111111 | 29.823 |
| 0.7930555555555556 | 29.823 |
| 0.7937500000000001 | 25.419 |
| 0.7944444444444444 | 21.024 |
| 0.7951388888888888 | 21.024 |
| 0.7958333333333334 | 16.636 |
| 0.7965277777777778 | 16.636 |
| 0.7972222222222222 | 12.257 |
| 0.7979166666666666 | 12.257 |
| 0.7986111111111112 | 12.257 |
| 0.7993055555555556 | 12.257 |
| 0.7999999999999999 | 12.257 |
| 0.8006944444444444 | 12.257 |
| 0.8013888888888889 | 12.257 |
| 0.8020833333333334 | 12.257 |
| 0.8027777777777777 | 12.257 |
| 0.8034722222222223 | 12.257 |
| 0.8041666666666667 | 12.257 |
| 0.8048611111111111 | 12.257 |
| 0.8055555555555555 | 12.257 |
| 0.80625 | 12.257 |
| 0.8069444444444445 | 12.257 |
| 0.8076388888888889 | 12.257 |
| 0.8083333333333332 | 12.257 |
| 0.8090277777777778 | 12.257 |
| 0.8097222222222222 | 12.257 |
| 0.8104166666666667 | 12.257 |
| 0.811111111111111 | 12.257 |
| 0.8118055555555556 | 12.257 |
| 0.8125 | 12.257 |
| 0.8131944444444444 | 12.257 |
| 0.813888888888889 | 7.887 |
| 0.8145833333333333 | 7.887 |
| 0.8152777777777778 | 7.887 |
| 0.8159722222222222 | 7.887 |
| 0.8166666666666668 | 7.887 |
| 0.8173611111111111 | 7.887 |
| 0.8180555555555555 | 7.887 |
| 0.81875 | 3.525 |
| 0.8194444444444445 | 3.525 |
| 0.8201388888888889 | 3.525 |
| 0.8208333333333333 | 3.525 |
| 0.8215277777777777 | 3.525 |
| 0.8222222222222223 | 3.525 |
| 0.8229166666666666 | 3.525 |
| 0.8236111111111111 | 3.525 |
| 0.8243055555555556 | 3.525 |
| 0.8250000000000001 | 3.525 |
| 0.8256944444444444 | 3.525 |
| 0.8263888888888888 | 3.525 |
| 0.8270833333333334 | 3.525 |
| 0.8277777777777778 | 3.525 |
| 0.8284722222222222 | 3.525 |
| 0.8291666666666666 | 3.525 |
| 0.8298611111111112 | 0 |
| 0.8305555555555556 | 0 |
| 0.8312499999999999 | 0 |
| 0.8319444444444444 | 0 |
| 0.8326388888888889 | 0 |
| 0.8333333333333334 | 0 |
| 0.8340277777777777 | 0 |
| 0.8347222222222223 | 0 |
| 0.8354166666666667 | 0 |
| 0.8361111111111111 | 0 |
| 0.8368055555555555 | 0 |
| 0.8375 | 0 |
| 0.8381944444444445 | 0 |
| 0.8388888888888889 | 0 |
| 0.8395833333333332 | 0 |
| 0.8402777777777778 | 0 |
| 0.8409722222222222 | 0 |
| 0.8416666666666667 | 0 |
| 0.842361111111111 | 0 |
| 0.8430555555555556 | 0 |
| 0.84375 | 0 |
| 0.8444444444444444 | 0 |
| 0.845138888888889 | 0 |
| 0.8458333333333333 | 0 |
| 0.8465277777777778 | 0 |
| 0.8472222222222222 | 0 |
| 0.8479166666666668 | 0 |
| 0.8486111111111111 | 0 |
| 0.8493055555555555 | 0 |
| 0.85 | 0 |
| 0.8506944444444445 | 0 |
| 0.8513888888888889 | 0 |
| 0.8520833333333333 | 0 |
| 0.8527777777777777 | 0 |
| 0.8534722222222223 | 0 |
| 0.8541666666666666 | 0 |
| 0.8548611111111111 | 0 |
| 0.8555555555555556 | 0 |
| 0.8562500000000001 | 0 |
| 0.8569444444444444 | 0 |
| 0.8576388888888888 | 0 |
| 0.8583333333333334 | 0 |
| 0.8590277777777778 | 0 |
| 0.8597222222222222 | 0 |
| 0.8604166666666666 | 0 |
| 0.8611111111111112 | 0 |
| 0.8618055555555556 | 0 |
| 0.8624999999999999 | 0 |
| 0.8631944444444444 | 0 |
| 0.8638888888888889 | 0 |
| 0.8645833333333334 | 0 |
| 0.8652777777777777 | 0 |
| 0.8659722222222223 | 0 |
| 0.8666666666666667 | 0 |
| 0.8673611111111111 | 0 |
| 0.8680555555555555 | 0 |
| 0.86875 | 0 |
| 0.8694444444444445 | 0 |
| 0.8701388888888889 | 0 |
| 0.8708333333333332 | 0 |
| 0.8715277777777778 | 0 |
| 0.8722222222222222 | 0 |
| 0.8729166666666667 | 0 |
| 0.873611111111111 | 0 |
| 0.8743055555555556 | 0 |
| 0.875 | 0 |
| 0.8756944444444444 | 0 |
| 0.876388888888889 | 0 |
| 0.8770833333333333 | 0 |
| 0.8777777777777778 | 0 |
| 0.8784722222222222 | 0 |
| 0.8791666666666668 | 0 |
| 0.8798611111111111 | 0 |
| 0.8805555555555555 | 0 |
| 0.88125 | 0 |
| 0.8819444444444445 | 0 |
| 0.8826388888888889 | 0 |
| 0.8833333333333333 | 0 |
| 0.8840277777777777 | 0 |
| 0.8847222222222223 | 0 |
| 0.8854166666666666 | 0 |
| 0.8861111111111111 | 0 |
| 0.8868055555555556 | 0 |
| 0.8875000000000001 | 0 |
| 0.8881944444444444 | 0 |
| 0.8888888888888888 | 0 |
| 0.8895833333333334 | 0 |
| 0.8902777777777778 | 0 |
| 0.8909722222222222 | 0 |
| 0.8916666666666666 | 0 |
| 0.8923611111111112 | 0 |
| 0.8930555555555556 | 0 |
| 0.8937499999999999 | 0 |
| 0.8944444444444444 | 0 |
| 0.8951388888888889 | 0 |
| 0.8958333333333334 | 0 |
| 0.8965277777777777 | 0 |
| 0.8972222222222223 | 0 |
| 0.8979166666666667 | 0 |
| 0.8986111111111111 | 0 |
| 0.8993055555555555 | 0 |
| 0.9 | 0 |
| 0.9006944444444445 | 0 |
| 0.9013888888888889 | 0 |
| 0.9020833333333332 | 0 |
| 0.9027777777777778 | 0 |
| 0.9034722222222222 | 0 |
| 0.9041666666666667 | 0 |
| 0.904861111111111 | 0 |
| 0.9055555555555556 | 0 |
| 0.90625 | 0 |
| 0.9069444444444444 | 0 |
| 0.907638888888889 | 0 |
| 0.9083333333333333 | 0 |
| 0.9090277777777778 | 0 |
| 0.9097222222222222 | 0 |
| 0.9104166666666668 | 0 |
| 0.9111111111111111 | 0 |
| 0.9118055555555555 | 0 |
| 0.9125 | 0 |
| 0.9131944444444445 | 0 |
| 0.9138888888888889 | 0 |
| 0.9145833333333333 | 0 |
| 0.9152777777777777 | 0 |
| 0.9159722222222223 | 0 |
| 0.9166666666666666 | 0 |
| 0.9173611111111111 | 0 |
| 0.9180555555555556 | 0 |
| 0.9187500000000001 | 0 |
| 0.9194444444444444 | 0 |
| 0.9201388888888888 | 0 |
| 0.9208333333333334 | 0 |
| 0.9215277777777778 | 0 |
| 0.9222222222222222 | 0 |
| 0.9229166666666666 | 0 |
| 0.9236111111111112 | 0 |
| 0.9243055555555556 | 0 |
| 0.9249999999999999 | 0 |
| 0.9256944444444444 | 0 |
| 0.9263888888888889 | 0 |
| 0.9270833333333334 | 0 |
| 0.9277777777777777 | 0 |
| 0.9284722222222223 | 0 |
| 0.9291666666666667 | 0 |
| 0.9298611111111111 | 0 |
| 0.9305555555555555 | 0 |
| 0.93125 | 0 |
| 0.9319444444444445 | 0 |
| 0.9326388888888889 | 0 |
| 0.9333333333333332 | 0 |
| 0.9340277777777778 | 0 |
| 0.9347222222222222 | 0 |
| 0.9354166666666667 | 0 |
| 0.936111111111111 | 0 |
| 0.9368055555555556 | 0 |
| 0.9375 | 0 |
| 0.9381944444444444 | 0 |
| 0.938888888888889 | 0 |
| 0.9395833333333333 | 0 |
| 0.9402777777777778 | 0 |
| 0.9409722222222222 | 0 |
| 0.9416666666666668 | 0 |
| 0.9423611111111111 | 0 |
| 0.9430555555555555 | 0 |
| 0.94375 | 0 |
| 0.9444444444444445 | 0 |
| 0.9451388888888889 | 0 |
| 0.9458333333333333 | 0 |
| 0.9465277777777777 | 0 |
| 0.9472222222222223 | 0 |
| 0.9479166666666666 | 0 |
| 0.9486111111111111 | 0 |
| 0.9493055555555556 | 0 |
| 0.9500000000000001 | 0 |
| 0.9506944444444444 | 0 |
| 0.9513888888888888 | 0 |
| 0.9520833333333334 | 0 |
| 0.9527777777777778 | 0 |
| 0.9534722222222222 | 0 |
| 0.9541666666666666 | 0 |
| 0.9548611111111112 | 0 |
| 0.9555555555555556 | 0 |
| 0.9562499999999999 | 0 |
| 0.9569444444444444 | 0 |
| 0.9576388888888889 | 0 |
| 0.9583333333333334 | 0 |
| 0.9590277777777777 | 0 |
| 0.9597222222222223 | 0 |
| 0.9604166666666667 | 0 |
| 0.9611111111111111 | 0 |
| 0.9618055555555555 | 0 |
| 0.9625 | 0 |
| 0.9631944444444445 | 0 |
| 0.9638888888888889 | 0 |
| 0.9645833333333332 | 0 |
| 0.9652777777777778 | 0 |
| 0.9659722222222222 | 0 |
| 0.9666666666666667 | 0 |
| 0.967361111111111 | 0 |
| 0.9680555555555556 | 0 |
| 0.96875 | 0 |
| 0.9694444444444444 | 0 |
| 0.970138888888889 | 0 |
| 0.9708333333333333 | 0 |
| 0.9715277777777778 | 0 |
| 0.9722222222222222 | 0 |
| 0.9729166666666668 | 0 |
| 0.9736111111111111 | 0 |
| 0.9743055555555555 | 0 |
| 0.975 | 0 |
| 0.9756944444444445 | 0 |
| 0.9763888888888889 | 0 |
| 0.9770833333333333 | 0 |
| 0.9777777777777777 | 0 |
| 0.9784722222222223 | 0 |
| 0.9791666666666666 | 0 |
| 0.9798611111111111 | 0 |
| 0.9805555555555556 | 0 |
| 0.9812500000000001 | 0 |
| 0.9819444444444444 | 0 |
| 0.9826388888888888 | 0 |
| 0.9833333333333334 | 0 |
| 0.9840277777777778 | 0 |
| 0.9847222222222222 | 0 |
| 0.9854166666666666 | 0 |
| 0.9861111111111112 | 0 |
| 0.9868055555555556 | 0 |
| 0.9874999999999999 | 0 |
| 0.9881944444444444 | 0 |
| 0.9888888888888889 | 0 |
| 0.9895833333333334 | 0 |
| 0.9902777777777777 | 0 |
| 0.9909722222222223 | 0 |
| 0.9916666666666667 | 0 |
| 0.9923611111111111 | 0 |
| 0.9930555555555555 | 0 |
| 0.99375 | 0 |
| 0.9944444444444445 | 0 |
| 0.9951388888888889 | 0 |
| 0.9958333333333332 | 0 |
| 0.9965277777777778 | 0 |
| 0.9972222222222222 | 0 |
| 0.9979166666666667 | 0 |
| 0.998611111111111 | 0 |
| 0.9993055555555556 | 0 |